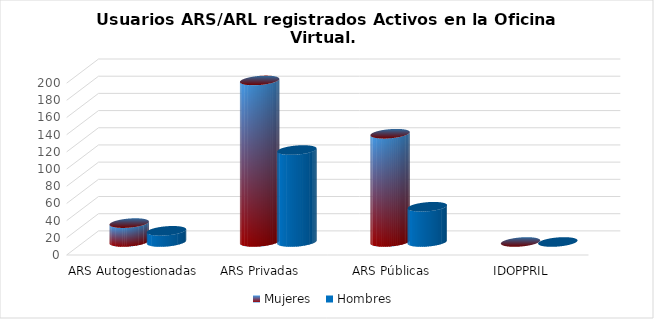
| Category | Mujeres | Hombres |
|---|---|---|
| ARS Autogestionadas | 22 | 13 |
| ARS Privadas | 188 | 107 |
| ARS Públicas | 126 | 41 |
| IDOPPRIL | 0 | 0 |